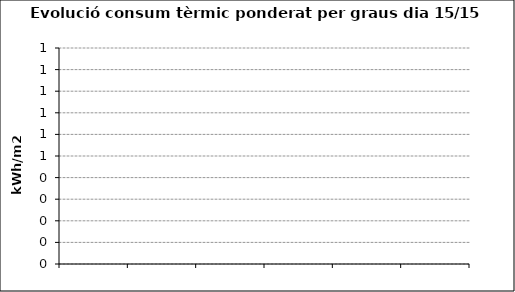
| Category | Consum tèrmic (kWh/m2) |
|---|---|
| 0 | 0 |
| 1 | 0 |
| 2 | 0 |
| 3 | 0 |
| 4 | 0 |
| 5 | 0 |